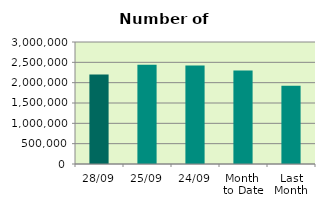
| Category | Series 0 |
|---|---|
| 28/09 | 2202388 |
| 25/09 | 2443442 |
| 24/09 | 2421128 |
| Month 
to Date | 2298286 |
| Last
Month | 1925290.095 |